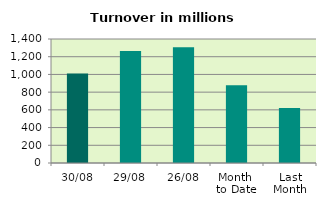
| Category | Series 0 |
|---|---|
| 30/08 | 1010.35 |
| 29/08 | 1264.614 |
| 26/08 | 1307.902 |
| Month 
to Date | 878.053 |
| Last
Month | 622.259 |